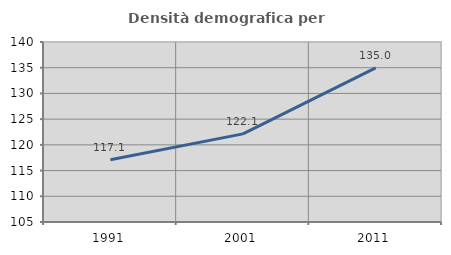
| Category | Densità demografica |
|---|---|
| 1991.0 | 117.122 |
| 2001.0 | 122.139 |
| 2011.0 | 134.951 |